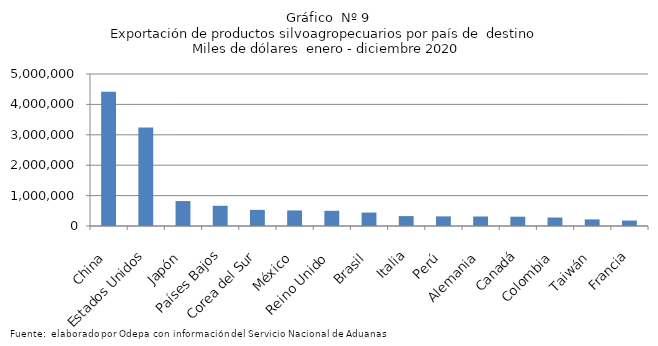
| Category | Series 0 |
|---|---|
| China | 4413845.588 |
| Estados Unidos | 3239931.437 |
| Japón | 820442.586 |
| Países Bajos | 665526.321 |
| Corea del Sur | 529794.712 |
| México | 511583.427 |
| Reino Unido | 499180.017 |
| Brasil | 442584.117 |
| Italia | 325733.499 |
| Perú | 316165.844 |
| Alemania | 312212.671 |
| Canadá | 306222.55 |
| Colombia | 278632.827 |
| Taiwán | 218069.297 |
| Francia | 179507.466 |